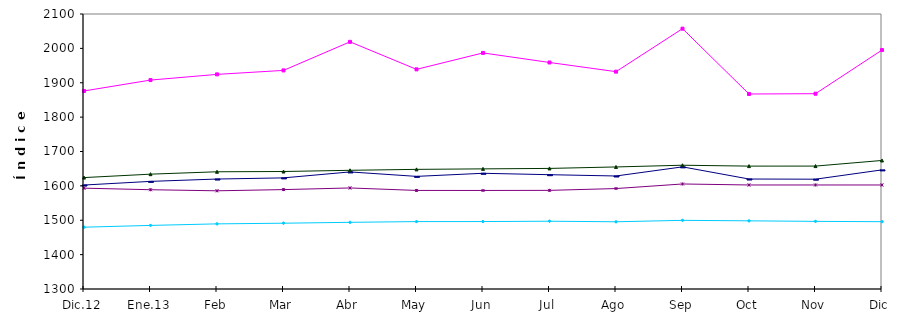
| Category | Series 0 | Series 1 | Series 2 | Series 3 | Series 4 |
|---|---|---|---|---|---|
| Dic.12 | 1602.423 | 1876.117 | 1624.126 | 1479.808 | 1593.333 |
| Ene.13 | 1613.051 | 1907.794 | 1634.049 | 1484.999 | 1588.818 |
| Feb | 1619.875 | 1924.331 | 1641.043 | 1489.463 | 1585.662 |
| Mar | 1623.263 | 1935.93 | 1641.774 | 1491.377 | 1589.152 |
| Abr | 1640.584 | 2019.002 | 1645.297 | 1493.961 | 1593.923 |
| May | 1627.616 | 1938.977 | 1648.034 | 1496.049 | 1586.761 |
| Jun | 1636.605 | 1986.777 | 1649.46 | 1496.217 | 1586.664 |
| Jul | 1632.509 | 1958.957 | 1650.802 | 1497.146 | 1586.953 |
| Ago | 1628.74 | 1932.246 | 1655.051 | 1495.565 | 1592.205 |
| Sep | 1655.307 | 2057.354 | 1660.048 | 1499.747 | 1605.511 |
| Oct | 1619.911 | 1867.242 | 1657.481 | 1498.294 | 1602.632 |
| Nov | 1619.413 | 1868.144 | 1657.554 | 1496.763 | 1602.632 |
| Dic | 1646.519 | 1995.112 | 1673.923 | 1495.806 | 1602.632 |